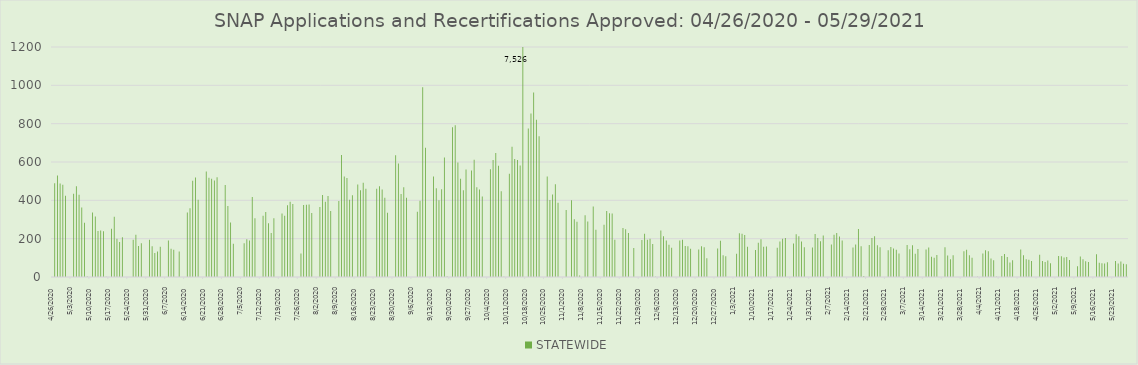
| Category | STATEWIDE |
|---|---|
| 4/27/20 | 489 |
| 4/28/20 | 529 |
| 4/29/20 | 488 |
| 4/30/20 | 481 |
| 5/1/20 | 424 |
| 5/4/20 | 434 |
| 5/5/20 | 474 |
| 5/6/20 | 429 |
| 5/7/20 | 363 |
| 5/8/20 | 283 |
| 5/9/20 | 2 |
| 5/11/20 | 337 |
| 5/12/20 | 316 |
| 5/13/20 | 240 |
| 5/14/20 | 243 |
| 5/15/20 | 239 |
| 5/16/20 | 1 |
| 5/18/20 | 252 |
| 5/19/20 | 315 |
| 5/20/20 | 199 |
| 5/21/20 | 183 |
| 5/22/20 | 207 |
| 5/26/20 | 194 |
| 5/27/20 | 221 |
| 5/28/20 | 162 |
| 5/29/20 | 176 |
| 6/1/20 | 194 |
| 6/2/20 | 160 |
| 6/3/20 | 125 |
| 6/4/20 | 133 |
| 6/5/20 | 158 |
| 6/8/20 | 190 |
| 6/9/20 | 147 |
| 6/10/20 | 142 |
| 6/12/20 | 133 |
| 6/15/20 | 336 |
| 6/16/20 | 359 |
| 6/17/20 | 502 |
| 6/18/20 | 519 |
| 6/19/20 | 403 |
| 6/22/20 | 551 |
| 6/23/20 | 518 |
| 6/24/20 | 513 |
| 6/25/20 | 503 |
| 6/26/20 | 521 |
| 6/29/20 | 480 |
| 6/30/20 | 371 |
| 7/1/20 | 284 |
| 7/2/20 | 174 |
| 7/6/20 | 176 |
| 7/7/20 | 197 |
| 7/8/20 | 190 |
| 7/9/20 | 417 |
| 7/10/20 | 307 |
| 7/13/20 | 320 |
| 7/14/20 | 339 |
| 7/15/20 | 280 |
| 7/16/20 | 229 |
| 7/17/20 | 307 |
| 7/20/20 | 331 |
| 7/21/20 | 320 |
| 7/22/20 | 374 |
| 7/23/20 | 392 |
| 7/24/20 | 381 |
| 7/27/20 | 122 |
| 7/28/20 | 376 |
| 7/29/20 | 377 |
| 7/30/20 | 378 |
| 7/31/20 | 334 |
| 8/3/20 | 365 |
| 8/4/20 | 428 |
| 8/5/20 | 392 |
| 8/6/20 | 422 |
| 8/7/20 | 345 |
| 8/10/20 | 396 |
| 8/11/20 | 636 |
| 8/12/20 | 524 |
| 8/13/20 | 517 |
| 8/14/20 | 403 |
| 8/15/20 | 426 |
| 8/17/20 | 482 |
| 8/18/20 | 453 |
| 8/19/20 | 492 |
| 8/20/20 | 461 |
| 8/24/20 | 460 |
| 8/25/20 | 473 |
| 8/26/20 | 457 |
| 8/27/20 | 414 |
| 8/28/20 | 335 |
| 8/31/20 | 635 |
| 9/1/20 | 592 |
| 9/2/20 | 433 |
| 9/3/20 | 468 |
| 9/4/20 | 413 |
| 9/8/20 | 341 |
| 9/9/20 | 398 |
| 9/10/20 | 990 |
| 9/11/20 | 674 |
| 9/14/20 | 525 |
| 9/15/20 | 463 |
| 9/16/20 | 400 |
| 9/17/20 | 458 |
| 9/18/20 | 624 |
| 9/19/20 | 2 |
| 9/21/20 | 781 |
| 9/22/20 | 792 |
| 9/23/20 | 597 |
| 9/24/20 | 513 |
| 9/25/20 | 452 |
| 9/26/20 | 561 |
| 9/28/20 | 556 |
| 9/29/20 | 612 |
| 9/30/20 | 468 |
| 10/1/20 | 456 |
| 10/2/20 | 420 |
| 10/5/20 | 562 |
| 10/6/20 | 611 |
| 10/7/20 | 647 |
| 10/8/20 | 580 |
| 10/9/20 | 447 |
| 10/10/20 | 1 |
| 10/12/20 | 539 |
| 10/13/20 | 680 |
| 10/14/20 | 616 |
| 10/15/20 | 610 |
| 10/16/20 | 582 |
| 10/17/20 | 7526 |
| 10/19/20 | 775 |
| 10/20/20 | 853 |
| 10/21/20 | 962 |
| 10/22/20 | 820 |
| 10/23/20 | 734 |
| 10/26/20 | 524 |
| 10/27/20 | 402 |
| 10/28/20 | 431 |
| 10/29/20 | 484 |
| 10/30/20 | 387 |
| 11/2/20 | 350 |
| 11/4/20 | 401 |
| 11/5/20 | 301 |
| 11/6/20 | 288 |
| 11/7/20 | 8 |
| 11/9/20 | 322 |
| 11/10/20 | 289 |
| 11/12/20 | 368 |
| 11/13/20 | 247 |
| 11/16/20 | 273 |
| 11/17/20 | 344 |
| 11/18/20 | 333 |
| 11/19/20 | 331 |
| 11/20/20 | 195 |
| 11/23/20 | 256 |
| 11/24/20 | 249 |
| 11/25/20 | 229 |
| 11/27/20 | 151 |
| 11/30/20 | 193 |
| 12/1/20 | 226 |
| 12/2/20 | 195 |
| 12/3/20 | 200 |
| 12/4/20 | 172 |
| 12/5/20 | 1 |
| 12/7/20 | 243 |
| 12/8/20 | 212 |
| 12/9/20 | 190 |
| 12/10/20 | 168 |
| 12/11/20 | 152 |
| 12/14/20 | 190 |
| 12/15/20 | 194 |
| 12/16/20 | 162 |
| 12/17/20 | 160 |
| 12/18/20 | 147 |
| 12/21/20 | 144 |
| 12/22/20 | 160 |
| 12/23/20 | 155 |
| 12/24/20 | 98 |
| 12/28/20 | 149 |
| 12/29/20 | 189 |
| 12/30/20 | 113 |
| 12/31/20 | 108 |
| 1/4/21 | 121 |
| 1/5/21 | 228 |
| 1/6/21 | 226 |
| 1/7/21 | 219 |
| 1/8/21 | 158 |
| 1/11/21 | 141 |
| 1/12/21 | 179 |
| 1/13/21 | 197 |
| 1/14/21 | 158 |
| 1/15/21 | 159 |
| 1/19/21 | 153 |
| 1/20/21 | 185 |
| 1/21/21 | 199 |
| 1/22/21 | 204 |
| 1/25/21 | 175 |
| 1/26/21 | 223 |
| 1/27/21 | 213 |
| 1/28/21 | 185 |
| 1/29/21 | 155 |
| 2/1/21 | 154 |
| 2/2/21 | 225 |
| 2/3/21 | 204 |
| 2/4/21 | 187 |
| 2/5/21 | 216 |
| 2/8/21 | 169 |
| 2/9/21 | 220 |
| 2/10/21 | 230 |
| 2/11/21 | 211 |
| 2/12/21 | 191 |
| 2/16/21 | 154 |
| 2/17/21 | 169 |
| 2/18/21 | 250 |
| 2/19/21 | 161 |
| 2/20/21 | 5 |
| 2/22/21 | 167 |
| 2/23/21 | 204 |
| 2/24/21 | 213 |
| 2/25/21 | 166 |
| 2/26/21 | 155 |
| 3/1/21 | 139 |
| 3/2/21 | 156 |
| 3/3/21 | 149 |
| 3/4/21 | 142 |
| 3/5/21 | 122 |
| 3/8/21 | 167 |
| 3/9/21 | 145 |
| 3/10/21 | 166 |
| 3/11/21 | 121 |
| 3/12/21 | 146 |
| 3/15/21 | 143 |
| 3/16/21 | 154 |
| 3/17/21 | 106 |
| 3/18/21 | 101 |
| 3/19/21 | 115 |
| 3/22/21 | 155 |
| 3/23/21 | 112 |
| 3/24/21 | 93 |
| 3/25/21 | 113 |
| 3/29/21 | 135 |
| 3/30/21 | 142 |
| 3/31/21 | 114 |
| 4/1/21 | 101 |
| 4/3/21 | 1 |
| 4/5/21 | 123 |
| 4/6/21 | 139 |
| 4/7/21 | 135 |
| 4/8/21 | 97 |
| 4/9/21 | 87 |
| 4/10/21 | 1 |
| 4/12/21 | 110 |
| 4/13/21 | 120 |
| 4/14/21 | 104 |
| 4/15/21 | 76 |
| 4/16/21 | 88 |
| 4/19/21 | 143 |
| 4/20/21 | 113 |
| 4/21/21 | 93 |
| 4/22/21 | 90 |
| 4/23/21 | 84 |
| 4/26/21 | 116 |
| 4/27/21 | 83 |
| 4/28/21 | 78 |
| 4/29/21 | 86 |
| 4/30/21 | 72 |
| 5/3/21 | 110 |
| 5/4/21 | 108 |
| 5/5/21 | 102 |
| 5/6/21 | 104 |
| 5/7/21 | 89 |
| 5/10/21 | 56 |
| 5/11/21 | 107 |
| 5/12/21 | 92 |
| 5/13/21 | 82 |
| 5/14/21 | 78 |
| 5/17/21 | 119 |
| 5/18/21 | 74 |
| 5/19/21 | 72 |
| 5/20/21 | 70 |
| 5/21/21 | 77 |
| 5/24/21 | 83 |
| 5/25/21 | 71 |
| 5/26/21 | 81 |
| 5/27/21 | 69 |
| 5/28/21 | 66 |